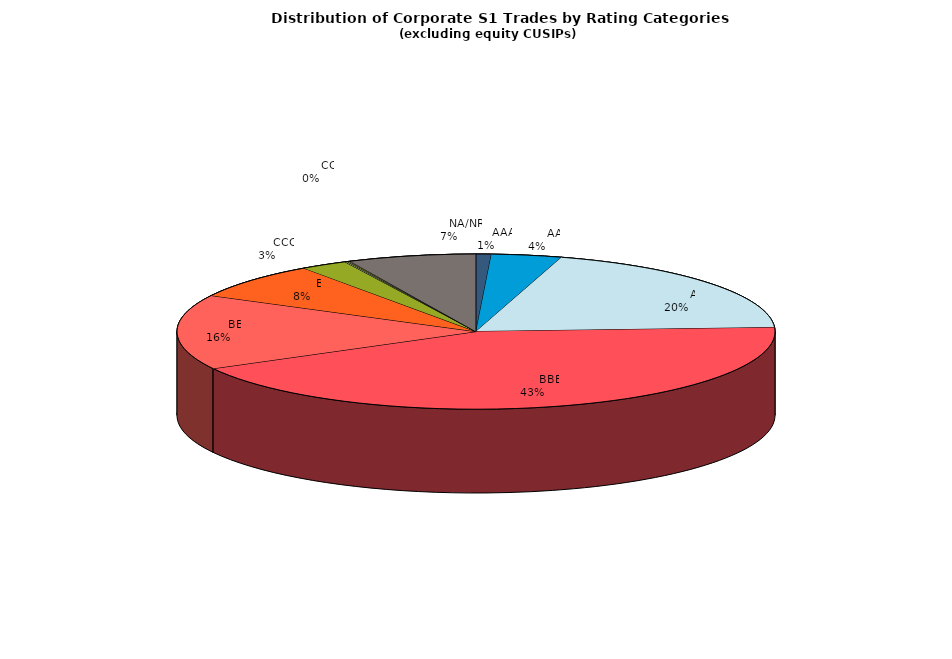
| Category | Series 0 |
|---|---|
|         AAA | 530.313 |
|         AA | 2433.806 |
|         A | 12537.425 |
|         BBB | 27537.179 |
|         BB | 10005.925 |
|         B | 4842 |
|         CCC | 1627.956 |
|         CC | 80.222 |
|         C | 75.829 |
|         D | 40.992 |
|         NA/NR | 4436.476 |